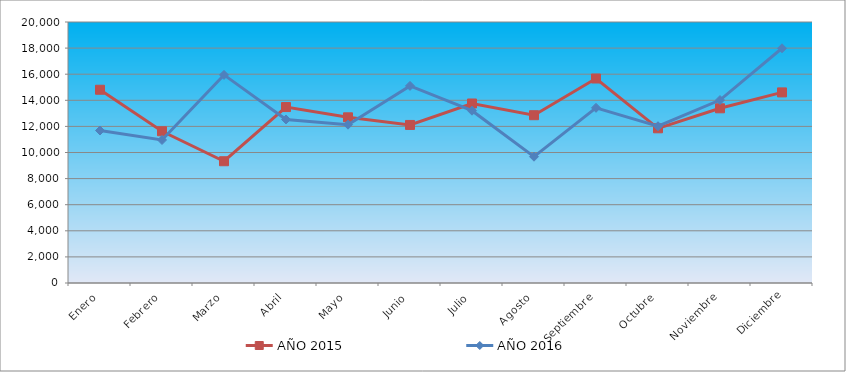
| Category | AÑO 2015 | AÑO 2016 |
|---|---|---|
| Enero | 14809 | 11685 |
| Febrero | 11628 | 10958 |
| Marzo | 9330 | 15947 |
| Abril | 13482 | 12532 |
| Mayo | 12696 | 12132 |
| Junio | 12111 | 15103 |
| Julio | 13755 | 13204 |
| Agosto | 12857 | 9677 |
| Septiembre | 15670 | 13425 |
| Octubre | 11854 | 12012 |
| Noviembre | 13387 | 14019 |
| Diciembre | 14605 | 17987 |